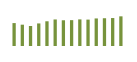
| Category | Saldo [ (1)-(2) ] |
|---|---|
| 0 | 532729.955 |
| 1 | 495602.949 |
| 2 | 464912.543 |
| 3 | 524886.84 |
| 4 | 575003.691 |
| 5 | 617133.535 |
| 6 | 598394.561 |
| 7 | 601130.812 |
| 8 | 618778.996 |
| 9 | 613783.089 |
| 10 | 640835.074 |
| 11 | 645614.486 |
| 12 | 650194 |
| 13 | 689934.963 |